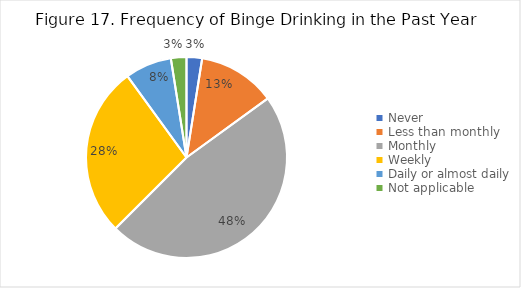
| Category | Series 0 |
|---|---|
| Never | 0.025 |
| Less than monthly | 0.125 |
| Monthly | 0.475 |
| Weekly | 0.275 |
| Daily or almost daily | 0.075 |
| Not applicable | 0.025 |